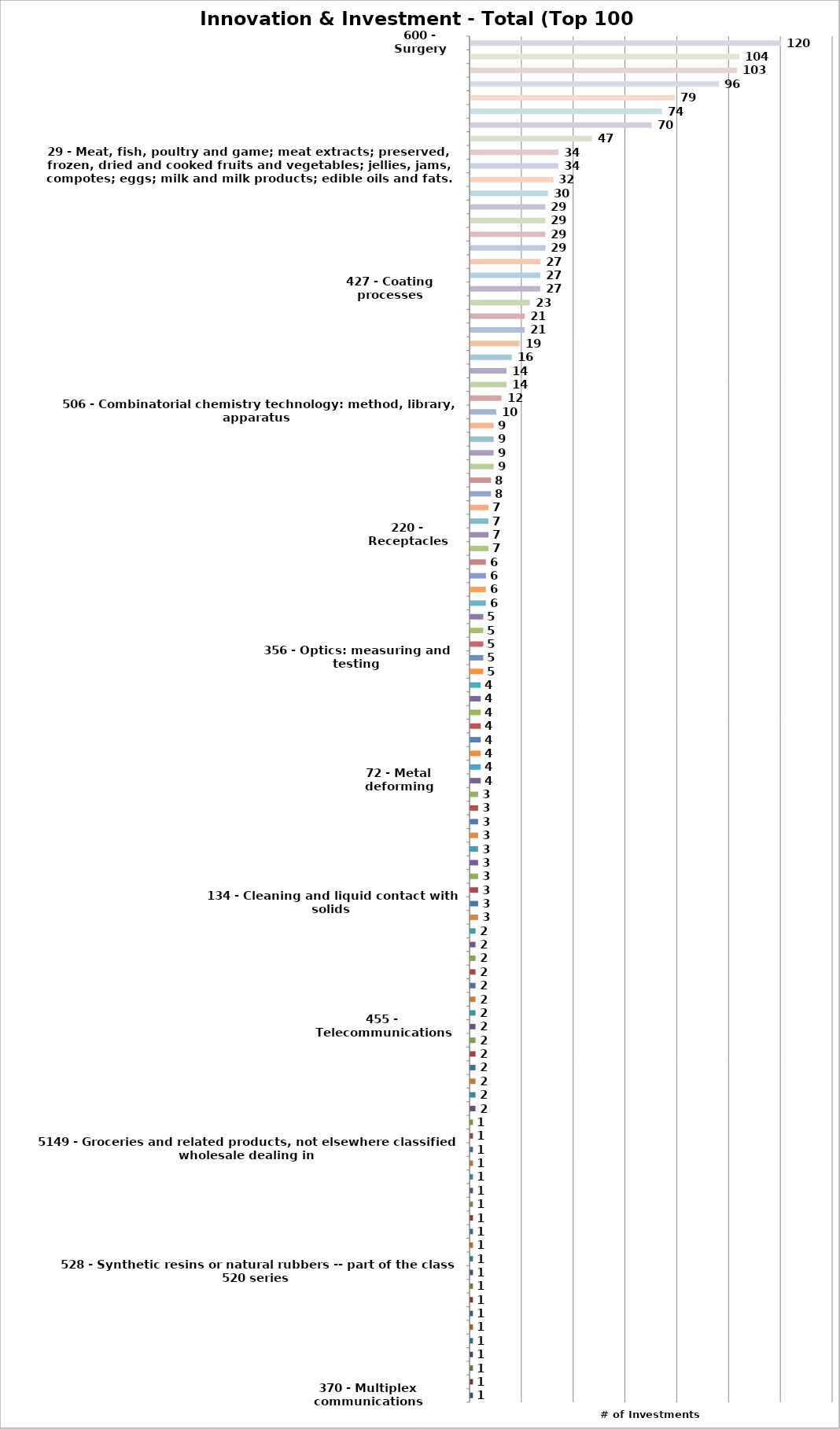
| Category | Investments |
|---|---|
| 370 - Multiplex communications | 1 |
| 374 - Thermal measuring and testing | 1 |
| 383 - Flexible bags | 1 |
| 386 - Motion video signal processing for recording or reproducing | 1 |
| 417 - Pumps | 1 |
| 425 - Plastic article or earthenware shaping or treating: apparatus | 1 |
| 451 - Abrading | 1 |
| 493 - Manufacturing container or tube from paper; or other manufacturing from a sheet or web | 1 |
| 524 - Synthetic resins or natural rubbers -- part of the class 520 series | 1 |
| 528 - Synthetic resins or natural rubbers -- part of the class 520 series | 1 |
| 556 - Organic compounds -- part of the class 532-570 series | 1 |
| 564 - Organic compounds -- part of the class 532-570 series | 1 |
| 706 - Data processing: artificial intelligence | 1 |
| 711 - Electrical computers and digital processing systems: memory | 1 |
| 715 - Data processing: presentation processing of document, operator interface processing, and screen saver display processing | 1 |
| 977 - Nanotechnology | 1 |
| 31 - Grains and agricultural, horticultural and forestry products not included in other classes; live animals; fresh fruits and vegetables; seeds; natural plants and flowers; foodstuffs for animals; malt. | 1 |
| 3841 - Surgical and medical instruments and apparatus | 1 |
| 5149 - Groceries and related products, not elsewhere classified wholesale dealing in | 1 |
| 5122 - Drugs, drug proprietaries, and druggists'sundries wholesale dealing in | 1 |
| 2023 - Dry, condensed and evapored dairy products manufacturing | 1 |
| 206 - Special receptacle or package | 2 |
| 215 - Bottles and jars | 2 |
| 222 - Dispensing | 2 |
| 250 - Radiant energy | 2 |
| 385 - Optical waveguides | 2 |
| 434 - Education and demonstration | 2 |
| 455 - Telecommunications | 2 |
| 523 - Synthetic resins or natural rubbers -- part of the class 520 series | 2 |
| 713 - Electrical computers and digital processing systems: support | 2 |
| 714 - Error detection/correction and fault detection/recovery | 2 |
| 717 - Data processing: software development, installation, and management | 2 |
| 726 - Information security | 2 |
| 36 - Insurance; financial affairs; monetary affairs; real estate affairs. | 2 |
| 2099 - Food preparations, not elsewhere classified | 2 |
| 128 - Surgery | 3 |
| 134 - Cleaning and liquid contact with solids | 3 |
| 216 - Etching a substrate: processes | 3 |
| 366 - Agitating | 3 |
| 428 - Stock material or miscellaneous articles | 3 |
| 544 - Organic compounds -- part of the class 532-570 series | 3 |
| 703 - Data processing: structural design, modeling, simulation, and emulation | 3 |
| 707 - Data processing: database and file management or data structures | 3 |
| 709 - Electrical computers and digital processing systems: multicomputer data transferring | 3 |
| 40 - Treatment of materials.
 | 3 |
| 72 - Metal deforming | 4 |
| 141 - Fluent material handling, with receiver or receiver coacting means | 4 |
| 252 - Compositions | 4 |
| 382 - Image analysis | 4 |
| 525 - Synthetic resins or natural rubbers -- part of the class 520 series | 4 |
| 546 - Organic compounds -- part of the class 532-570 series | 4 |
| 37 - Building construction; repair; installation services. | 4 |
| 8731 - Commercial physical and biological research | 4 |
| 118 - Coating apparatus | 5 |
| 356 - Optics: measuring and testing | 5 |
| 548 - Organic compounds -- part of the class 532-570 series | 5 |
| 1 - Chemicals used in industry, science and photography, as well as in agriculture, horticulture and forestry; unprocessed artificial resins, unprocessed plastics; manures; fire extinguishing compositions; tempering and soldering preparations; chemical su | 5 |
| 2834 - Pharmaceutical preparations manufacturing | 5 |
| 53 - Package making | 6 |
| 156 - Adhesive bonding and miscellaneous chemical manufacture | 6 |
| 324 - Electricity: measuring and testing | 6 |
| 32 - Beers; mineral and aerated waters and other non-alcoholic beverages; fruit beverages and fruit juices; syrups and other preparations for making beverages. | 6 |
| 148 - Metal treatment | 7 |
| 220 - Receptacles | 7 |
| 30 - Coffee, tea, cocoa and artificial coffee; rice; tapioca and sago; flour and preparations made from cereals; bread, pastry and confectionery; ices; sugar, honey, treacle; yeast, baking-powder; salt; mustard; vinegar, sauces (condiments); spices; ice. | 7 |
| 17 - Rubber, gutta-percha, gum, asbestos, mica and goods made from these materials and not included in other classes; plastics in extruded form for use in manufacture; packing, stopping and insulating materials; flexible pipes, not of metal. | 7 |
| 340 - Communications: electrical | 8 |
| 530 - Chemistry: natural resins or derivatives; peptides or proteins; lignins or reaction products thereof | 8 |
| 73 - Measuring and testing | 9 |
| 219 - Electric heating | 9 |
| 705 - Data processing: financial, business practice, management, or cost/price determination | 9 |
| 45 - Legal services; security services for the protection of property and individuals; personal and social services rendered by others to meet the needs of individuals. | 9 |
| 506 - Combinatorial chemistry technology: method, library, apparatus | 10 |
| 264 - Plastic and nonmetallic article shaping or treating: processes | 12 |
| 536 - Organic compounds -- part of the class 532-570 series | 14 |
| 41 - Education; providing of training; entertainment; sporting and cultural activities. | 14 |
| 9 - Scientific, nautical, surveying, photographic, cinematographic, optical, weighing, measuring, signalling, checking (supervision), life-saving and teaching apparatus and instruments; apparatus and instruments for conducting, switching, transforming, ac | 16 |
| 436 - Chemistry: analytical and immunological testing | 19 |
| 205 - Electrolysis: processes, compositions used therein, and methods of preparing the compositions | 21 |
| 35 - Advertising; business management; business administration; office functions. | 21 |
| 204 - Chemistry: electrical and wave energy | 23 |
| 427 - Coating processes | 27 |
| 702 - Data processing: measuring, calibrating, or testing | 27 |
| 16 - Paper, cardboard and goods made from these materials, not included in other classes; printed matter; bookbinding material; photographs; stationery; adhesives for stationery or household purposes; artists' materials; paint brushes; typewriters and off | 27 |
| 29 - Metal working | 29 |
| 351 - Optics: eye examining, vision testing and correcting | 29 |
| 422 - Chemical apparatus and process disinfecting, deodorizing, preserving, or sterilizing | 29 |
| 42 - Scientific and technological services and research and design relating thereto; industrial analysis and research services; design and development of computer hardware and software. | 29 |
| 424 - Drug, bio-affecting and body treating compositions | 30 |
| 426 - Food or edible material: processes, compositions, and products | 32 |
| 29 - Meat, fish, poultry and game; meat extracts; preserved, frozen, dried and cooked fruits and vegetables; jellies, jams, compotes; eggs; milk and milk products; edible oils and fats. | 34 |
| 44 - Medical services; veterinary services; hygienic and beauty care for human beings or animals; agriculture, horticulture and forestry services. | 34 |
| 514 - Drug, bio-affecting and body treating compositions | 47 |
| 435 - Chemistry: molecular biology and microbiology | 70 |
| 604 - Surgery | 74 |
| 10 - Surgical, medical, dental and veterinary apparatus and instruments, artificial limbs, eyes and teeth; orthopaedic articles; suture materials. | 79 |
| 623 - Prosthesis (i.e., artificial body members), parts thereof, or aids and accessories therefor | 96 |
| 606 - Surgery | 103 |
| 5 - Pharmaceutical and veterinary preparations; sanitary preparations for medical purposes; dietetic food and substances adapted for medical or veterinary use, food for babies; dietary supplements for humans and animals; plasters, materials for dressings; | 104 |
| 600 - Surgery | 120 |